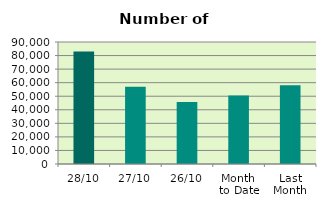
| Category | Series 0 |
|---|---|
| 28/10 | 82966 |
| 27/10 | 56938 |
| 26/10 | 45694 |
| Month 
to Date | 50563.7 |
| Last
Month | 58072.091 |